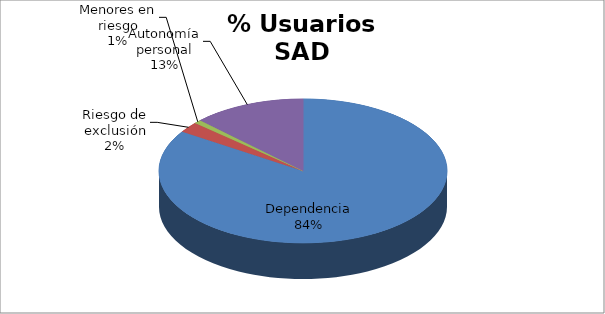
| Category | Series 0 |
|---|---|
| Dependencia | 4735 |
| Riesgo de exclusión | 134 |
| Menores en riesgo | 45 |
| Autonomía personal | 711 |